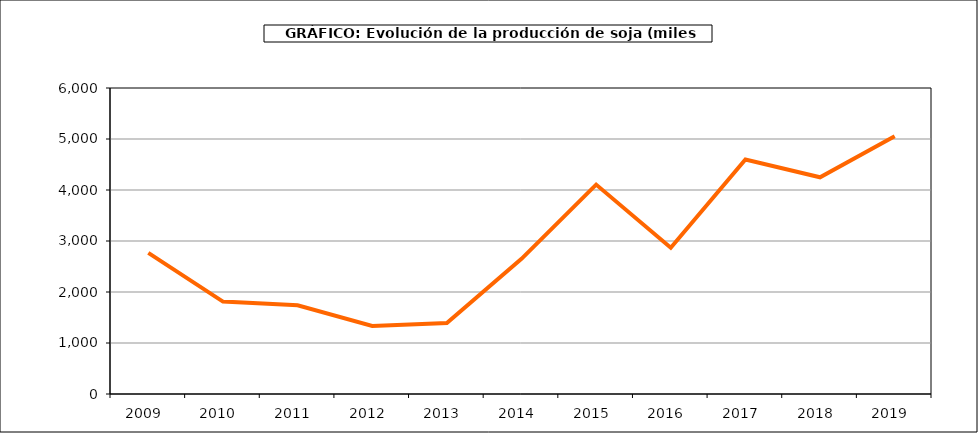
| Category | Producción |
|---|---|
| 2009.0 | 2767 |
| 2010.0 | 1812 |
| 2011.0 | 1740 |
| 2012.0 | 1333 |
| 2013.0 | 1390 |
| 2014.0 | 2650 |
| 2015.0 | 4106 |
| 2016.0 | 2869 |
| 2017.0 | 4599 |
| 2018.0 | 4249 |
| 2019.0 | 5053 |